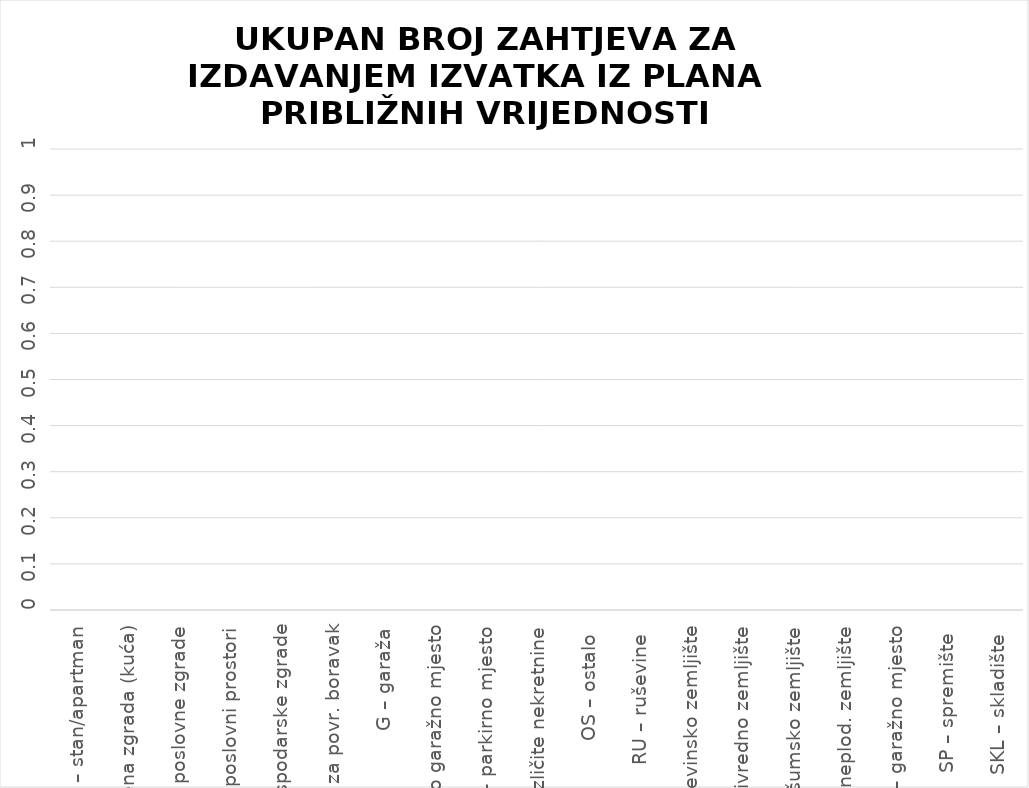
| Category | BROJ ZAPRIMLJENIH ZAHTJEVA | BROJ IZDANIH IZVADAKA IZ PLANA |
|---|---|---|
| ST – stan/apartman | 0 | 0 |
| OK – stambena zgrada (kuća) | 0 | 0 |
| PZG – poslovne zgrade | 0 | 0 |
| PP – poslovni prostori | 0 | 0 |
| GZG – gospodarske zgrade | 0 | 0 |
| VIK – nekretn. za povr. boravak | 0 | 0 |
| G – garaža | 0 | 0 |
| PGM – parkirno garažno mjesto | 0 | 0 |
| VPM – parkirno mjesto | 0 | 0 |
| RN – različite nekretnine | 0 | 0 |
| OS – ostalo  | 0 | 0 |
| RU – ruševine  | 0 | 0 |
| GZ – građevinsko zemljište | 0 | 0 |
| PZ – poljoprivredno zemljište | 0 | 0 |
| ŠZ – šumsko zemljište | 0 | 0 |
| PNZ – prirodno neplod. zemljište | 0 | 0 |
| GM – garažno mjesto | 0 | 0 |
| SP – spremište  | 0 | 0 |
| SKL – skladište  | 0 | 0 |